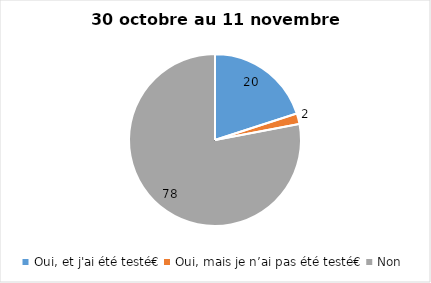
| Category | Series 0 |
|---|---|
| Oui, et j'ai été testé€ | 20 |
| Oui, mais je n’ai pas été testé€ | 2 |
| Non | 78 |